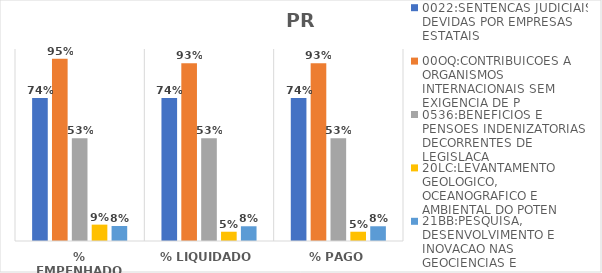
| Category | 0022:SENTENCAS JUDICIAIS DEVIDAS POR EMPRESAS ESTATAIS | 00OQ:CONTRIBUICOES A ORGANISMOS INTERNACIONAIS SEM EXIGENCIA DE P | 0536:BENEFICIOS E PENSOES INDENIZATORIAS DECORRENTES DE LEGISLACA | 20LC:LEVANTAMENTO GEOLOGICO, OCEANOGRAFICO E AMBIENTAL DO POTEN | 21BB:PESQUISA, DESENVOLVIMENTO E INOVACAO NAS GEOCIENCIAS E |
|---|---|---|---|---|---|
| % EMPENHADO | 0.744 | 0.95 | 0.535 | 0.085 | 0.078 |
| % LIQUIDADO | 0.744 | 0.926 | 0.535 | 0.048 | 0.077 |
| % PAGO | 0.744 | 0.926 | 0.535 | 0.048 | 0.077 |